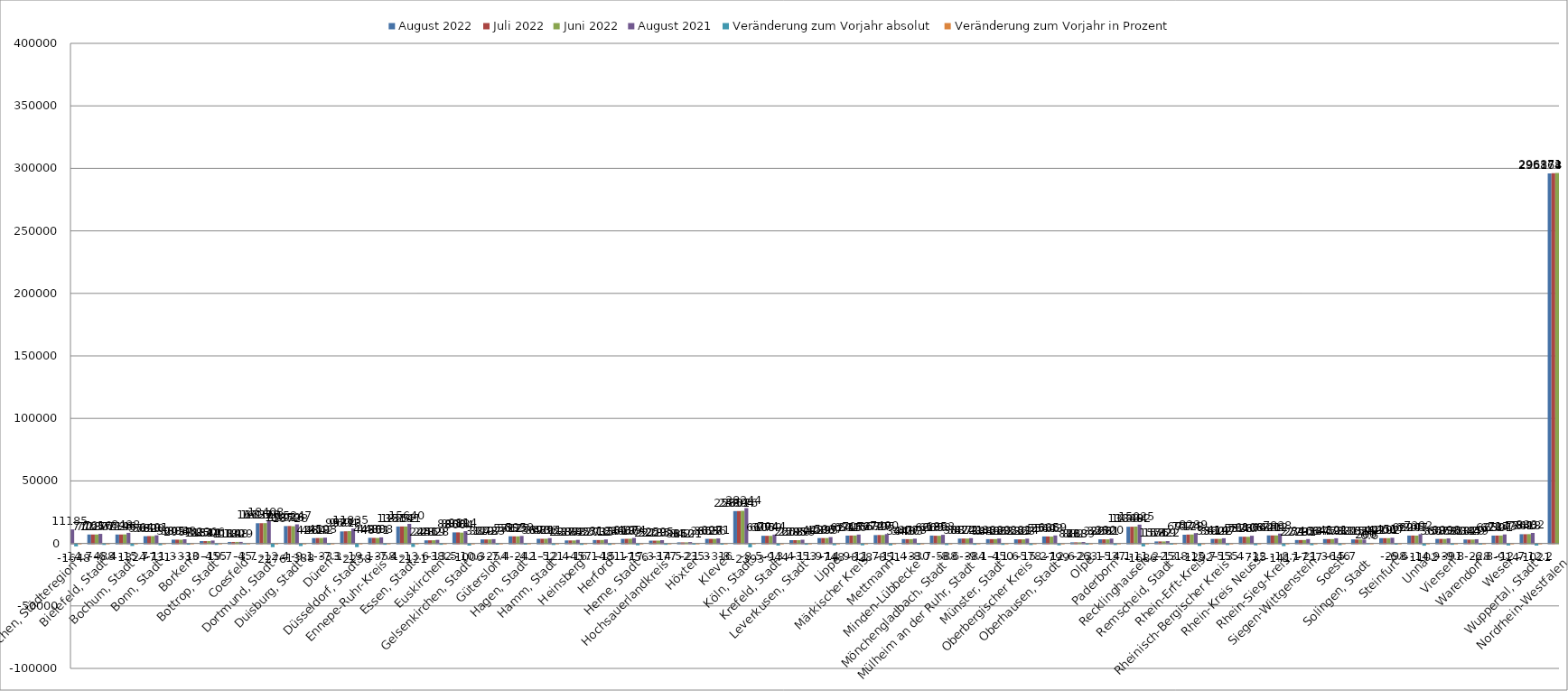
| Category | August 2022 | Juli 2022 | Juni 2022 | August 2021 | Veränderung zum Vorjahr absolut | Veränderung zum Vorjahr in Prozent |
|---|---|---|---|---|---|---|
| Aachen, Städteregion | 9537 | 9649 | 9741 | 11185 | -1648 | -14.7 |
| Bielefeld, Stadt | 7128 | 7125 | 7130 | 7616 | -488 | -6.4 |
| Bochum, Stadt | 7114 | 7126 | 7196 | 8438 | -1324 | -15.7 |
| Bonn, Stadt | 5760 | 5850 | 5820 | 6491 | -731 | -11.3 |
| Borken | 3005 | 3004 | 2937 | 3338 | -333 | -10 |
| Bottrop, Stadt | 1851 | 1850 | 1844 | 2306 | -455 | -19.7 |
| Coesfeld | 1184 | 1180 | 1198 | 1229 | -45 | -3.7 |
| Dortmund, Stadt | 16132 | 16160 | 16216 | 18408 | -2276 | -12.4 |
| Duisburg, Stadt | 13859 | 13916 | 13728 | 15247 | -1388 | -9.1 |
| Düren | 4260 | 4319 | 4342 | 4593 | -333 | -7.3 |
| Düsseldorf, Stadt | 9577 | 9694 | 9813 | 11835 | -2258 | -19.1 |
| Ennepe-Ruhr-Kreis | 4480 | 4430 | 4351 | 4838 | -358 | -7.4 |
| Essen, Stadt | 13519 | 13552 | 13541 | 15640 | -2121 | -13.6 |
| Euskirchen | 2446 | 2482 | 2519 | 2828 | -382 | -13.5 |
| Gelsenkirchen, Stadt | 8808 | 8818 | 8604 | 9814 | -1006 | -10.3 |
| Gütersloh | 3179 | 3172 | 3197 | 3433 | -254 | -7.4 |
| Hagen, Stadt | 5717 | 5653 | 5625 | 5959 | -242 | -4.1 |
| Hamm, Stadt | 3690 | 3689 | 3733 | 4211 | -521 | -12.4 |
| Heinsberg | 2388 | 2378 | 2378 | 2845 | -457 | -16.1 |
| Herford | 2703 | 2712 | 2715 | 3184 | -481 | -15.1 |
| Herne, Stadt | 3618 | 3666 | 3699 | 4374 | -756 | -17.3 |
| Hochsauerlandkreis | 2218 | 2223 | 2235 | 2595 | -377 | -14.5 |
| Höxter | 866 | 842 | 852 | 1101 | -235 | -21.3 |
| Kleve | 3655 | 3628 | 3636 | 3971 | -316 | -8 |
| Köln, Stadt | 25851 | 25894 | 26076 | 28244 | -2393 | -8.5 |
| Krefeld, Stadt | 6100 | 6074 | 6059 | 7044 | -944 | -13.4 |
| Leverkusen, Stadt | 2603 | 2585 | 2580 | 2956 | -353 | -11.9 |
| Lippe | 4289 | 4286 | 4295 | 5037 | -748 | -14.9 |
| Märkischer Kreis | 6244 | 6315 | 6325 | 7072 | -828 | -11.7 |
| Mettmann | 6639 | 6727 | 6705 | 7490 | -851 | -11.4 |
| Minden-Lübbecke | 3443 | 3406 | 3403 | 3773 | -330 | -8.7 |
| Mönchengladbach, Stadt | 6265 | 6139 | 6093 | 6853 | -588 | -8.6 |
| Mülheim an der Ruhr, Stadt | 3837 | 3874 | 3871 | 4221 | -384 | -9.1 |
| Münster, Stadt | 3439 | 3422 | 3466 | 3889 | -450 | -11.6 |
| Oberbergischer Kreis | 3236 | 3223 | 3223 | 3814 | -578 | -15.2 |
| Oberhausen, Stadt | 5560 | 5566 | 5443 | 6359 | -799 | -12.6 |
| Olpe | 876 | 882 | 888 | 1139 | -263 | -23.1 |
| Paderborn | 3263 | 3252 | 3261 | 3800 | -537 | -14.1 |
| Recklinghausen | 13339 | 13334 | 13482 | 15025 | -1686 | -11.2 |
| Remscheid, Stadt | 1571 | 1572 | 1569 | 1822 | -251 | -13.8 |
| Rhein-Erft-Kreis | 6947 | 7074 | 7128 | 8239 | -1292 | -15.7 |
| Rheinisch-Bergischer Kreis | 3592 | 3619 | 3602 | 4147 | -555 | -13.4 |
| Rhein-Kreis Neuss | 5373 | 5340 | 5267 | 6108 | -735 | -12 |
| Rhein-Sieg-Kreis | 6421 | 6389 | 6402 | 7838 | -1417 | -18.1 |
| Siegen-Wittgenstein | 2729 | 2710 | 2731 | 3466 | -737 | -21.3 |
| Soest | 3475 | 3459 | 3478 | 4121 | -646 | -15.7 |
| Solingen, Stadt | 3215 | 3155 | 3159 | 3015 | 200 | 6.6 |
| Steinfurt | 4219 | 4200 | 4202 | 4517 | -298 | -6.6 |
| Unna | 6290 | 6306 | 6247 | 7392 | -1102 | -14.9 |
| Viersen | 3607 | 3585 | 3568 | 3998 | -391 | -9.8 |
| Warendorf | 3131 | 3044 | 3079 | 3359 | -228 | -6.8 |
| Wesel | 6259 | 6284 | 6301 | 7173 | -914 | -12.7 |
| Wuppertal, Stadt | 7361 | 7340 | 7418 | 8382 | -1021 | -12.2 |
| Nordrhein-Westfalen | 295868 | 296174 | 296371 | 335772 | -39904 | -11.9 |